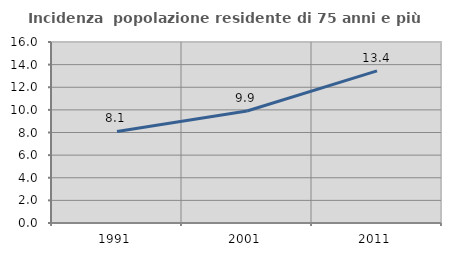
| Category | Incidenza  popolazione residente di 75 anni e più |
|---|---|
| 1991.0 | 8.096 |
| 2001.0 | 9.897 |
| 2011.0 | 13.445 |